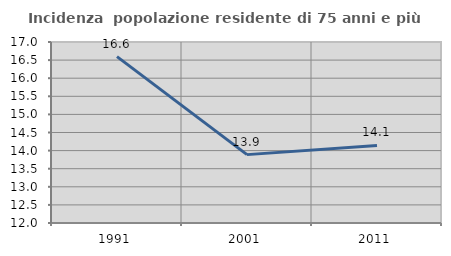
| Category | Incidenza  popolazione residente di 75 anni e più |
|---|---|
| 1991.0 | 16.595 |
| 2001.0 | 13.889 |
| 2011.0 | 14.141 |